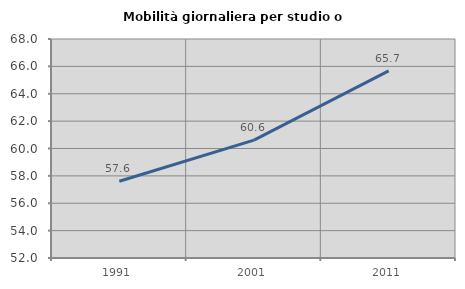
| Category | Mobilità giornaliera per studio o lavoro |
|---|---|
| 1991.0 | 57.607 |
| 2001.0 | 60.612 |
| 2011.0 | 65.666 |